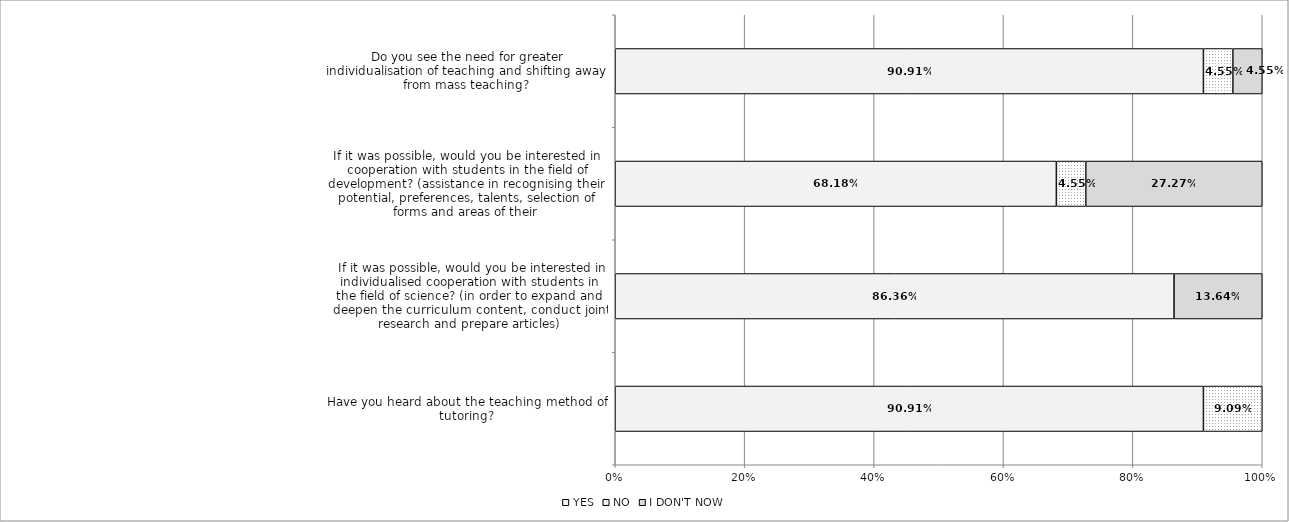
| Category | YES | NO | I DON'T NOW |
|---|---|---|---|
| Have you heard about the teaching method of tutoring? | 0.909 | 0.091 | 0 |
|  If it was possible, would you be interested in individualised cooperation with students in the field of science? (in order to expand and deepen the curriculum content, conduct joint research and prepare articles) | 0.864 | 0 | 0.136 |
| If it was possible, would you be interested in cooperation with students in the field of development? (assistance in recognising their potential, preferences, talents, selection of forms and areas of their  | 0.682 | 0.045 | 0.273 |
|  Do you see the need for greater individualisation of teaching and shifting away from mass teaching? | 0.909 | 0.045 | 0.045 |